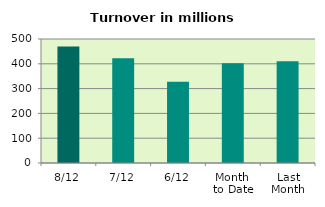
| Category | Series 0 |
|---|---|
| 8/12 | 469.472 |
| 7/12 | 422.244 |
| 6/12 | 328.105 |
| Month 
to Date | 402.287 |
| Last
Month | 410.338 |